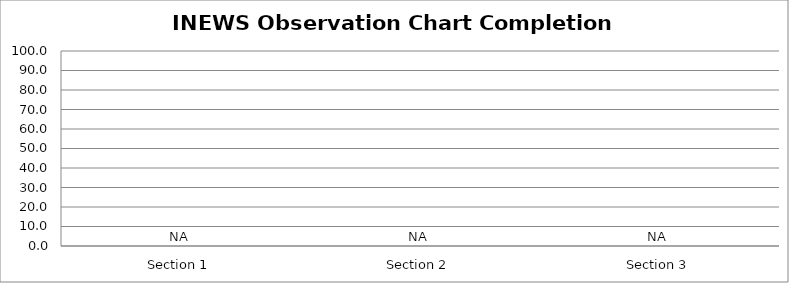
| Category | Series 0 |
|---|---|
| Section 1 | 0 |
| Section 2 | 0 |
| Section 3 | 0 |